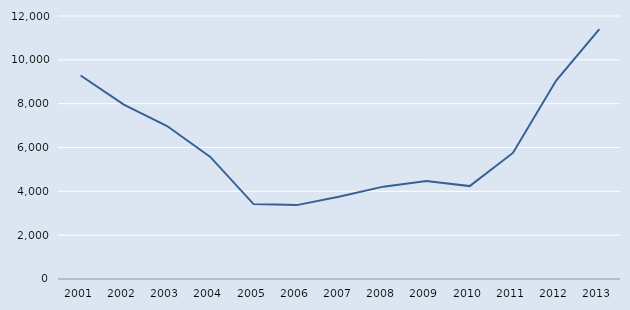
| Category | Series 0 |
|---|---|
| 2001.0 | 9287 |
| 2002.0 | 7955 |
| 2003.0 | 6981 |
| 2004.0 | 5570 |
| 2005.0 | 3418 |
| 2006.0 | 3371 |
| 2007.0 | 3766 |
| 2008.0 | 4214 |
| 2009.0 | 4468 |
| 2010.0 | 4238 |
| 2011.0 | 5752 |
| 2012.0 | 9054 |
| 2013.0 | 11401 |